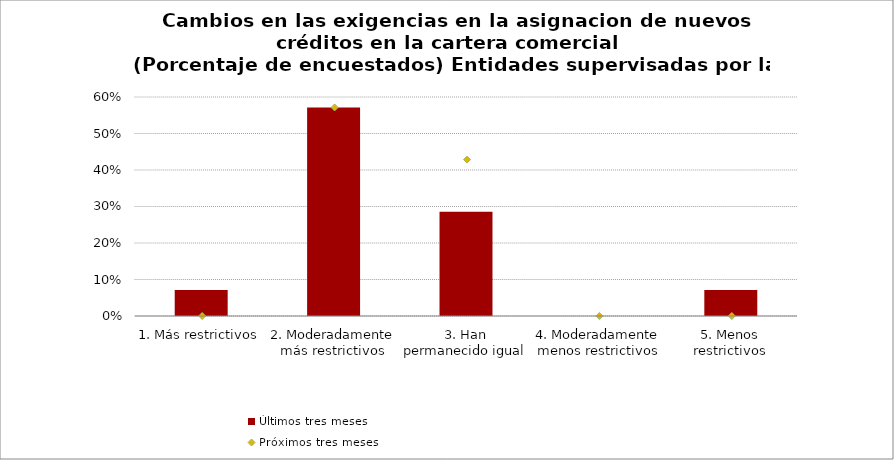
| Category | Últimos tres meses |
|---|---|
| 1. Más restrictivos | 0.071 |
| 2. Moderadamente más restrictivos | 0.571 |
| 3. Han permanecido igual | 0.286 |
| 4. Moderadamente menos restrictivos | 0 |
| 5. Menos restrictivos | 0.071 |